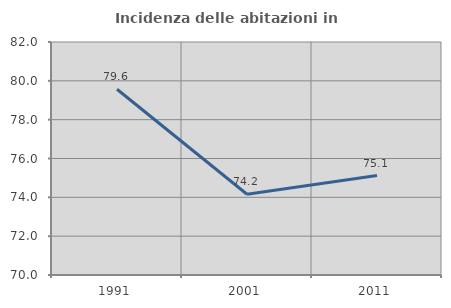
| Category | Incidenza delle abitazioni in proprietà  |
|---|---|
| 1991.0 | 79.567 |
| 2001.0 | 74.159 |
| 2011.0 | 75.12 |